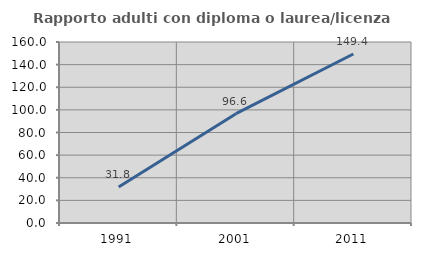
| Category | Rapporto adulti con diploma o laurea/licenza media  |
|---|---|
| 1991.0 | 31.849 |
| 2001.0 | 96.646 |
| 2011.0 | 149.425 |